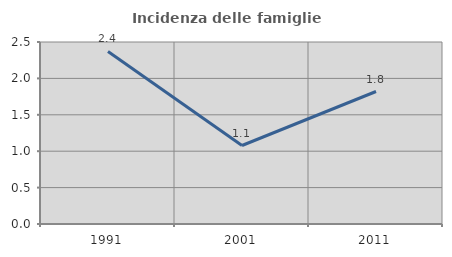
| Category | Incidenza delle famiglie numerose |
|---|---|
| 1991.0 | 2.37 |
| 2001.0 | 1.078 |
| 2011.0 | 1.82 |